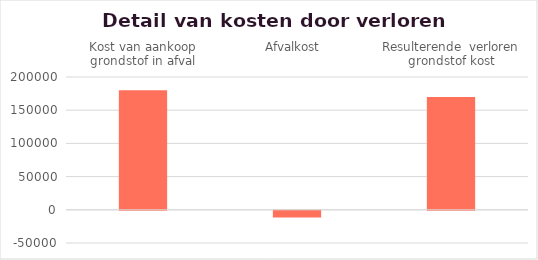
| Category | Series 0 |
|---|---|
| Kost van aankoop grondstof in afval | 180000 |
| Afvalkost  | -10000 |
| Resulterende  verloren grondstof kost | 170000 |